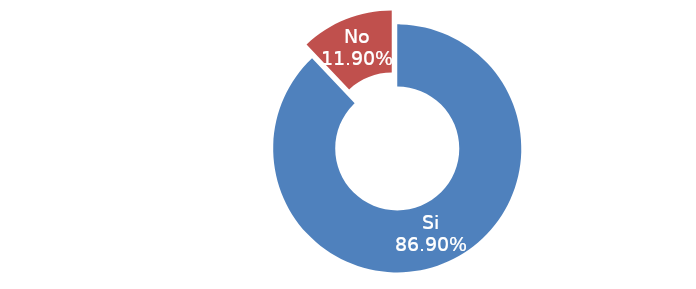
| Category | Series 0 |
|---|---|
| Si | 0.869 |
| No | 0.119 |